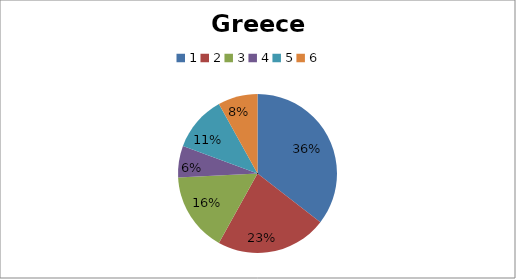
| Category | Greece |
|---|---|
| 0 | 22 |
| 1 | 14 |
| 2 | 10 |
| 3 | 4 |
| 4 | 7 |
| 5 | 5 |